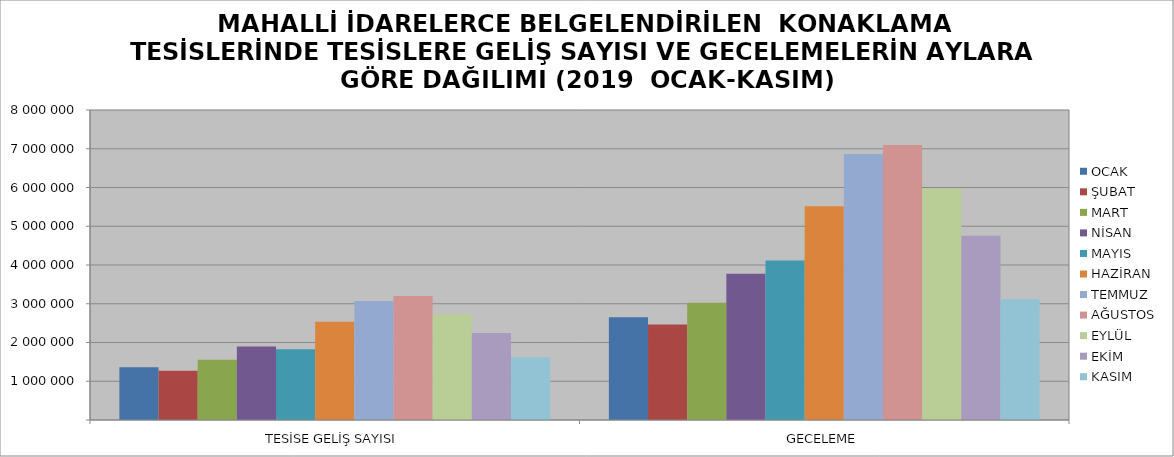
| Category | OCAK | ŞUBAT | MART | NİSAN | MAYIS | HAZİRAN | TEMMUZ | AĞUSTOS | EYLÜL | EKİM | KASIM |
|---|---|---|---|---|---|---|---|---|---|---|---|
| TESİSE GELİŞ SAYISI | 1363187 | 1273727 | 1552518 | 1898202 | 1826154 | 2537491 | 3073499 | 3201724 | 2721047 | 2242115 | 1617176 |
| GECELEME | 2649437 | 2462023 | 3024704 | 3772615 | 4117532 | 5513568 | 6866550 | 7097153 | 5980815 | 4758060 | 3114074 |